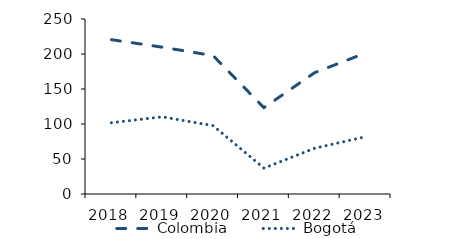
| Category | Colombia |
|---|---|
| 2018.0 | 220.47 |
| 2019.0 | 209.737 |
| 2020.0 | 197.716 |
| 2021.0 | 123.344 |
| 2022.0 | 173.421 |
| 2023.0 | 201.397 |